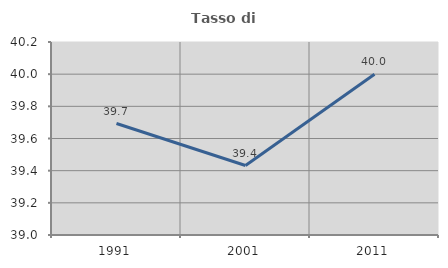
| Category | Tasso di occupazione   |
|---|---|
| 1991.0 | 39.693 |
| 2001.0 | 39.432 |
| 2011.0 | 40 |